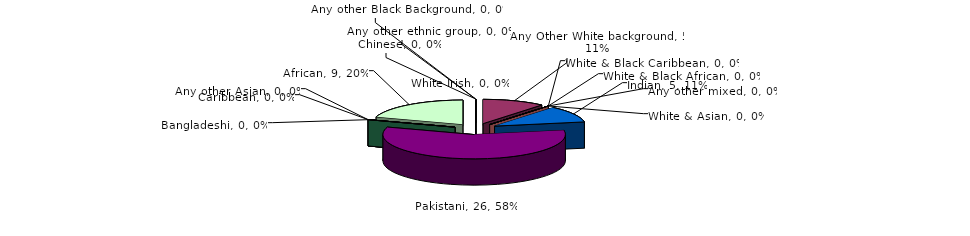
| Category | Series 0 |
|---|---|
| White Irish | 0 |
| Any Other White background | 5 |
| White & Black Caribbean | 0 |
| White & Black African | 0 |
| White & Asian | 0 |
| Any other mixed | 0 |
| Indian | 5 |
| Pakistani | 26 |
| Bangladeshi | 0 |
| Any other Asian | 0 |
| Caribbean | 0 |
| African | 9 |
| Any other Black Background | 0 |
| Chinese | 0 |
| Any other ethnic group | 0 |